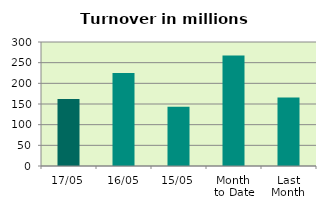
| Category | Series 0 |
|---|---|
| 17/05 | 161.999 |
| 16/05 | 224.952 |
| 15/05 | 143.279 |
| Month 
to Date | 267.633 |
| Last
Month | 165.638 |